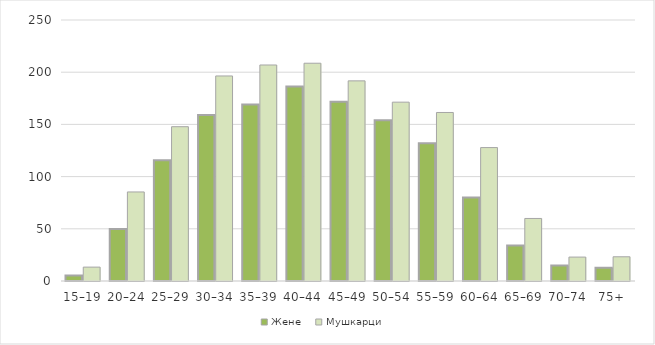
| Category | Жене | Мушкарци |
|---|---|---|
| 15–19 | 5.2 | 13.3 |
| 20–24 | 49.9 | 85.3 |
| 25–29 | 115.7 | 147.8 |
| 30–34 | 159 | 196.4 |
| 35–39 | 169.1 | 206.9 |
| 40–44 | 186.4 | 208.6 |
| 45–49 | 171.7 | 191.7 |
| 50–54 | 153.9 | 171.3 |
| 55–59 | 131.9 | 161.4 |
| 60–64 | 80.1 | 127.8 |
| 65–69 | 34 | 59.9 |
| 70–74 | 14.8 | 22.9 |
| 75+ | 12.6 | 23.2 |